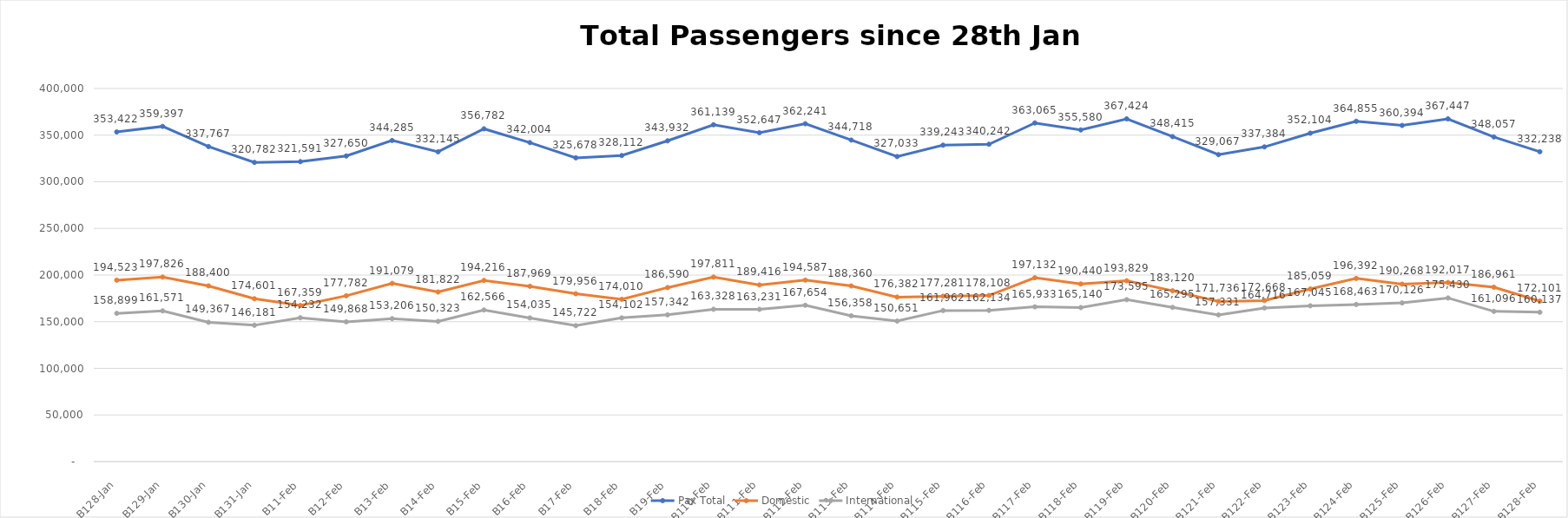
| Category | Pax Total |  Domestic  |  International  |
|---|---|---|---|
| 2023-01-28 | 353422 | 194523 | 158899 |
| 2023-01-29 | 359397 | 197826 | 161571 |
| 2023-01-30 | 337767 | 188400 | 149367 |
| 2023-01-31 | 320782 | 174601 | 146181 |
| 2023-02-01 | 321591 | 167359 | 154232 |
| 2023-02-02 | 327650 | 177782 | 149868 |
| 2023-02-03 | 344285 | 191079 | 153206 |
| 2023-02-04 | 332145 | 181822 | 150323 |
| 2023-02-05 | 356782 | 194216 | 162566 |
| 2023-02-06 | 342004 | 187969 | 154035 |
| 2023-02-07 | 325678 | 179956 | 145722 |
| 2023-02-08 | 328112 | 174010 | 154102 |
| 2023-02-09 | 343932 | 186590 | 157342 |
| 2023-02-10 | 361139 | 197811 | 163328 |
| 2023-02-11 | 352647 | 189416 | 163231 |
| 2023-02-12 | 362241 | 194587 | 167654 |
| 2023-02-13 | 344718 | 188360 | 156358 |
| 2023-02-14 | 327033 | 176382 | 150651 |
| 2023-02-15 | 339243 | 177281 | 161962 |
| 2023-02-16 | 340242 | 178108 | 162134 |
| 2023-02-17 | 363065 | 197132 | 165933 |
| 2023-02-18 | 355580 | 190440 | 165140 |
| 2023-02-19 | 367424 | 193829 | 173595 |
| 2023-02-20 | 348415 | 183120 | 165295 |
| 2023-02-21 | 329067 | 171736 | 157331 |
| 2023-02-22 | 337384 | 172668 | 164716 |
| 2023-02-23 | 352104 | 185059 | 167045 |
| 2023-02-24 | 364855 | 196392 | 168463 |
| 2023-02-25 | 360394 | 190268 | 170126 |
| 2023-02-26 | 367447 | 192017 | 175430 |
| 2023-02-27 | 348057 | 186961 | 161096 |
| 2023-02-28 | 332238 | 172101 | 160137 |